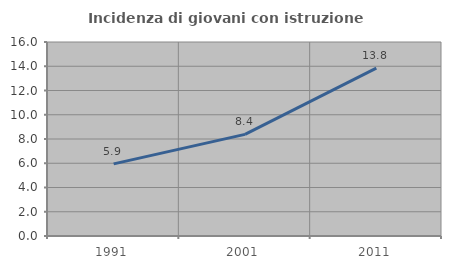
| Category | Incidenza di giovani con istruzione universitaria |
|---|---|
| 1991.0 | 5.948 |
| 2001.0 | 8.38 |
| 2011.0 | 13.846 |